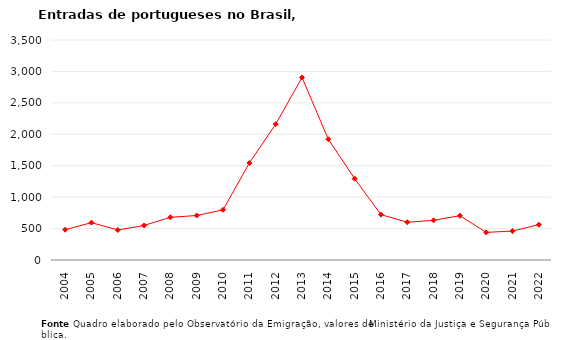
| Category | Entradas |
|---|---|
| 2004.0 | 482 |
| 2005.0 | 595 |
| 2006.0 | 477 |
| 2007.0 | 550 |
| 2008.0 | 679 |
| 2009.0 | 708 |
| 2010.0 | 798 |
| 2011.0 | 1543 |
| 2012.0 | 2161 |
| 2013.0 | 2904 |
| 2014.0 | 1921 |
| 2015.0 | 1294 |
| 2016.0 | 722 |
| 2017.0 | 601 |
| 2018.0 | 631 |
| 2019.0 | 705 |
| 2020.0 | 439 |
| 2021.0 | 461 |
| 2022.0 | 562 |